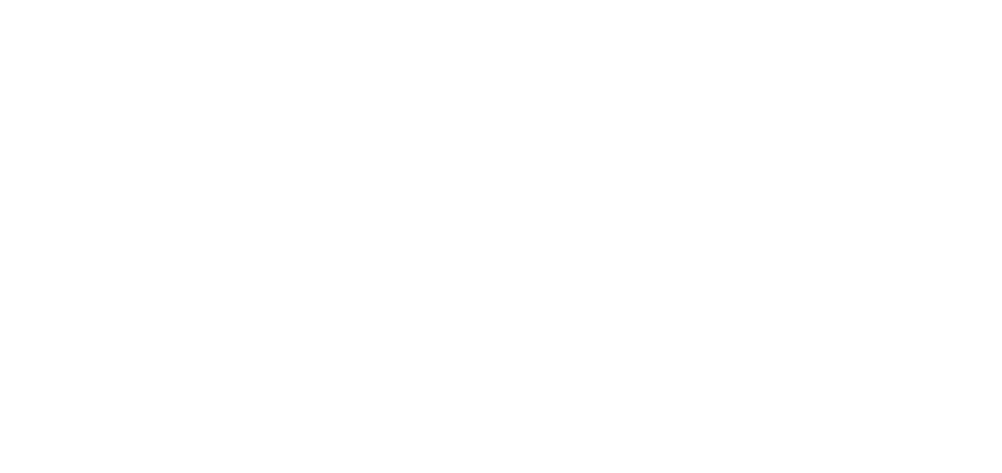
| Category | Total |
|---|---|
| Al Hodeidah | 578 |
| Hajjah | 484 |
| Marib | 212 |
| Taiz | 199 |
| Al Jawf | 171 |
| Amran | 150 |
| Hadramawt | 105 |
| Ad Dali | 97 |
| Lahj | 75 |
| Abyan | 65 |
| Sanaa | 52 |
| Sadah | 46 |
| Ibb | 45 |
| Aden | 41 |
| Al Bayda | 37 |
| Dhamar | 22 |
| Shabwah | 19 |
| Al Maharah | 12 |
| Raymah | 8 |
| Al Mahwit | 8 |
| Sanaa City | 4 |
| Socotra | 1 |